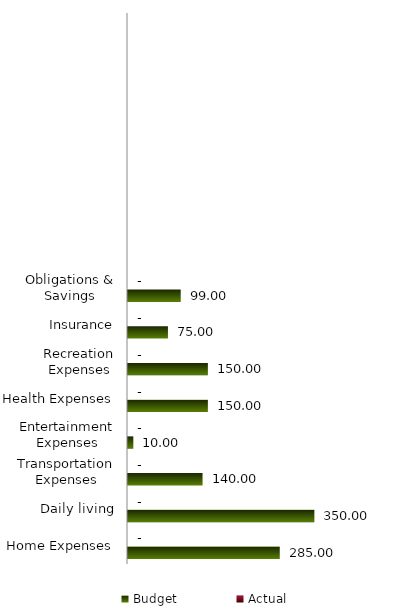
| Category | Budget | Actual |
|---|---|---|
| Home Expenses | 285 | 0 |
| Daily living | 350 | 0 |
| Transportation Expenses | 140 | 0 |
| Entertainment Expenses | 10 | 0 |
| Health Expenses | 150 | 0 |
| Recreation Expenses | 150 | 0 |
| Insurance | 75 | 0 |
| Obligations & Savings | 99 | 0 |